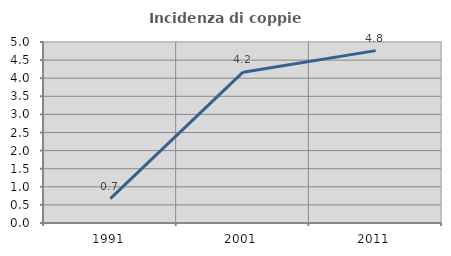
| Category | Incidenza di coppie miste |
|---|---|
| 1991.0 | 0.673 |
| 2001.0 | 4.167 |
| 2011.0 | 4.762 |